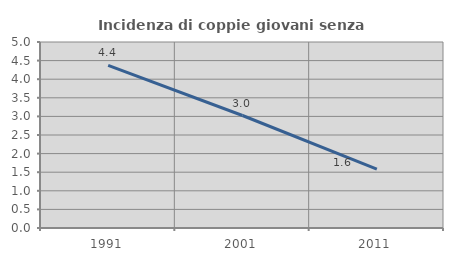
| Category | Incidenza di coppie giovani senza figli |
|---|---|
| 1991.0 | 4.374 |
| 2001.0 | 3.024 |
| 2011.0 | 1.585 |